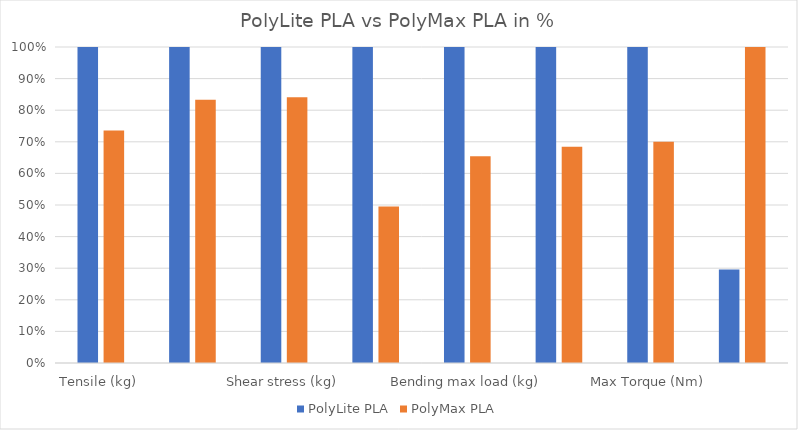
| Category | PolyLite PLA | PolyMax PLA |
|---|---|---|
| Tensile (kg) | 1 | 0.736 |
| Layer adhesion (kg) | 1 | 0.833 |
| Shear stress (kg) | 1 | 0.841 |
| Bending 2mm deform (kg) | 1 | 0.495 |
| Bending max load (kg) | 1 | 0.654 |
| Torque 90° (Nm) | 1 | 0.684 |
| Max Torque (Nm) | 1 | 0.7 |
| IZOD impact test kJ/m2 | 0.296 | 1 |